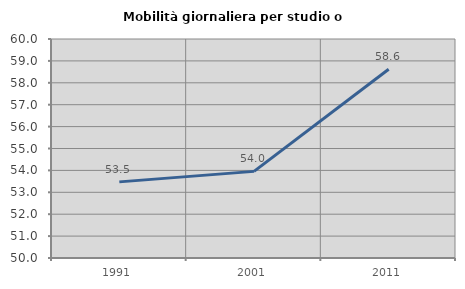
| Category | Mobilità giornaliera per studio o lavoro |
|---|---|
| 1991.0 | 53.476 |
| 2001.0 | 53.956 |
| 2011.0 | 58.617 |